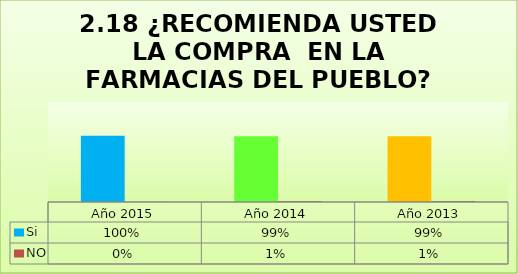
| Category | Si  | NO |
|---|---|---|
| Año 2015 | 0.995 | 0.005 |
| Año 2014 | 0.986 | 0.014 |
| Año 2013 | 0.986 | 0.014 |